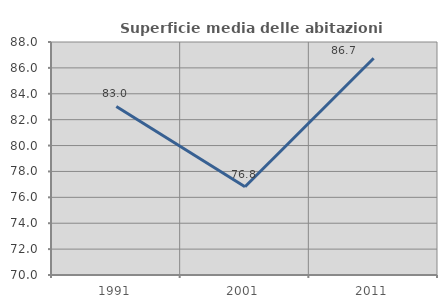
| Category | Superficie media delle abitazioni occupate |
|---|---|
| 1991.0 | 83.024 |
| 2001.0 | 76.815 |
| 2011.0 | 86.747 |